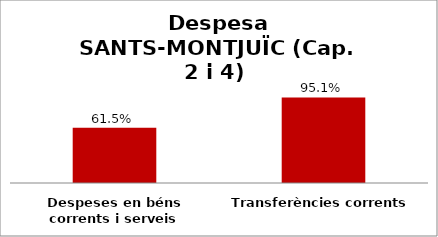
| Category | Series 0 |
|---|---|
| Despeses en béns corrents i serveis | 0.615 |
| Transferències corrents | 0.951 |